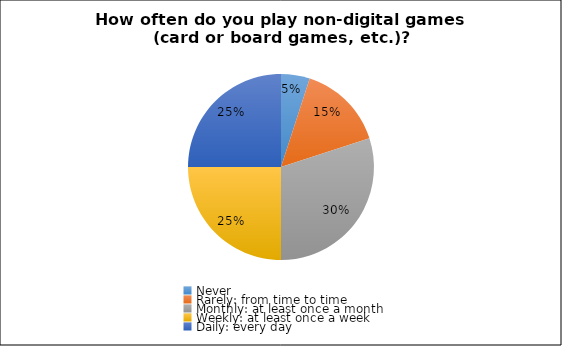
| Category | Series 0 |
|---|---|
| Never | 1 |
| Rarely: from time to time | 3 |
| Monthly: at least once a month | 6 |
| Weekly: at least once a week | 5 |
| Daily: every day | 5 |